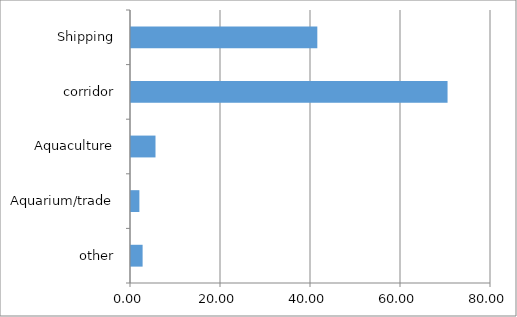
| Category | Series 0 |
|---|---|
| other | 2.579 |
| Aquarium/trade | 1.862 |
| Aquaculture | 5.444 |
| corridor | 70.344 |
| Shipping | 41.404 |